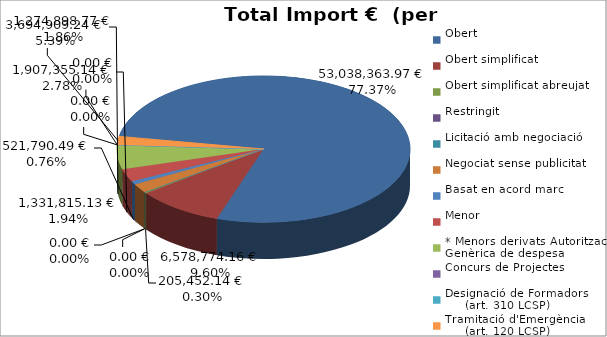
| Category | Total preu
(amb IVA) |
|---|---|
| Obert | 53038363.973 |
| Obert simplificat | 6578774.156 |
| Obert simplificat abreujat | 205452.14 |
| Restringit | 0 |
| Licitació amb negociació | 0 |
| Negociat sense publicitat | 1331815.128 |
| Basat en acord marc | 521790.488 |
| Menor | 1907355.14 |
| * Menors derivats Autorització Genèrica de despesa | 3694909.24 |
| Concurs de Projectes | 0 |
| Designació de Formadors
     (art. 310 LCSP) | 0 |
| Tramitació d'Emergència
     (art. 120 LCSP) | 1274898.774 |